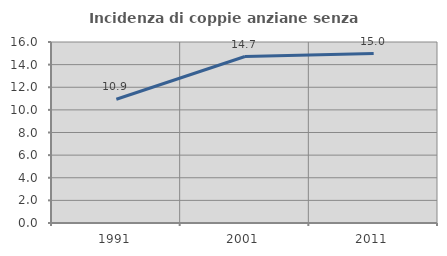
| Category | Incidenza di coppie anziane senza figli  |
|---|---|
| 1991.0 | 10.936 |
| 2001.0 | 14.716 |
| 2011.0 | 14.979 |